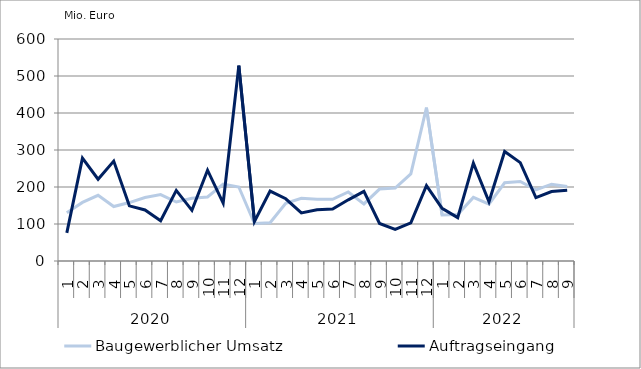
| Category | Baugewerblicher Umsatz | Auftragseingang |
|---|---|---|
| 0 | 130445.562 | 75891.481 |
| 1 | 158433.655 | 277923.85 |
| 2 | 177529.832 | 220973.626 |
| 3 | 147259.799 | 269936.091 |
| 4 | 157965.891 | 149072.895 |
| 5 | 171647.778 | 137984.76 |
| 6 | 179530.732 | 108645.965 |
| 7 | 159480.457 | 190771.468 |
| 8 | 169638.111 | 136988.906 |
| 9 | 173040.053 | 245341.603 |
| 10 | 207619.085 | 156647.224 |
| 11 | 199947.086 | 528166.004 |
| 12 | 101295.895 | 106850.127 |
| 13 | 103236.543 | 188883.434 |
| 14 | 156172.725 | 168204.42 |
| 15 | 169257.088 | 130052.073 |
| 16 | 166897.821 | 138492.214 |
| 17 | 166720.216 | 140262.426 |
| 18 | 186515.191 | 165331.191 |
| 19 | 154188.941 | 188169.655 |
| 20 | 194464.12 | 101359.538 |
| 21 | 197281.201 | 85626.862 |
| 22 | 235325.083 | 102880.924 |
| 23 | 414469.471 | 203900.676 |
| 24 | 124217.549 | 142351.759 |
| 25 | 125619.696 | 117194.423 |
| 26 | 171896.664 | 264509.013 |
| 27 | 153384.654 | 160146.519 |
| 28 | 211335.38 | 295997.826 |
| 29 | 214914.164 | 265813.917 |
| 30 | 192047.613 | 171529.517 |
| 31 | 207577.681 | 187809.656 |
| 32 | 201109.781 | 190941.096 |